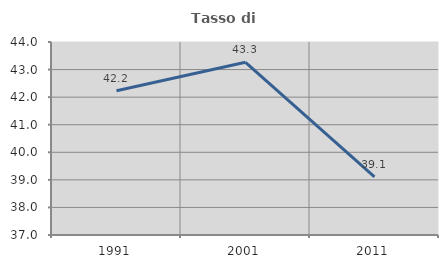
| Category | Tasso di occupazione   |
|---|---|
| 1991.0 | 42.23 |
| 2001.0 | 43.265 |
| 2011.0 | 39.106 |